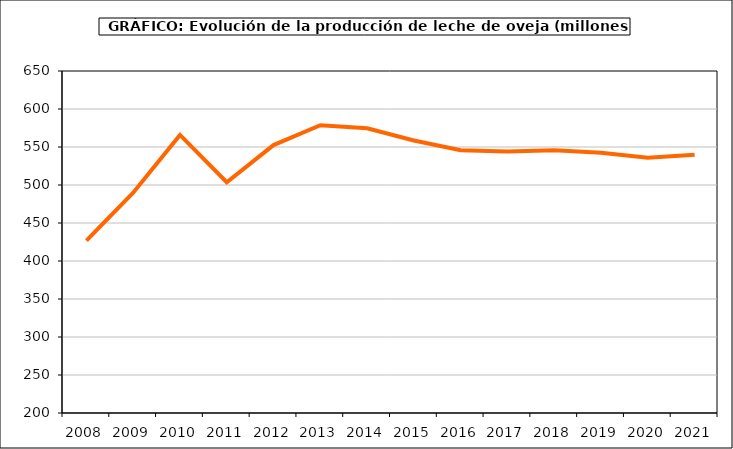
| Category | leche oveja |
|---|---|
| 2008.0 | 426.918 |
| 2009.0 | 489.823 |
| 2010.0 | 565.948 |
| 2011.0 | 503.6 |
| 2012.0 | 552.517 |
| 2013.0 | 578.581 |
| 2014.0 | 574.682 |
| 2015.0 | 558.55 |
| 2016.0 | 545.653 |
| 2017.0 | 544.106 |
| 2018.0 | 545.622 |
| 2019.0 | 542.285 |
| 2020.0 | 535.884 |
| 2021.0 | 539.791 |